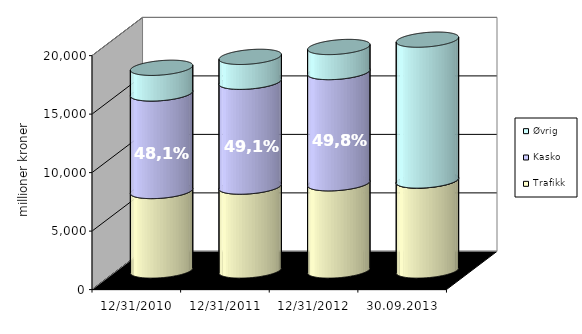
| Category | Trafikk | Kasko | Øvrig |
|---|---|---|---|
| 31.12.2010 | 6795.7 | 8339.721 | 2191.06 |
| 31.12.2011 | 7171.76 | 8962.957 | 2126.121 |
| 31.12.2012 | 7457.552 | 9507.808 | 2139.625 |
| 30.09.2013 | 7692.537 | 0 | 12039.874 |